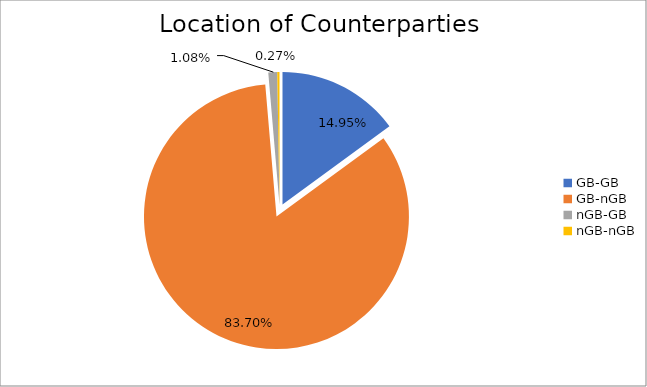
| Category | Series 0 |
|---|---|
| GB-GB | 1331983.183 |
| GB-nGB | 7456855.009 |
| nGB-GB | 96357.201 |
| nGB-nGB | 24119.534 |